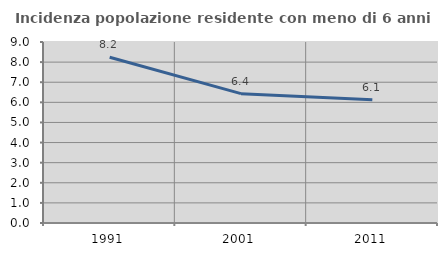
| Category | Incidenza popolazione residente con meno di 6 anni |
|---|---|
| 1991.0 | 8.239 |
| 2001.0 | 6.432 |
| 2011.0 | 6.133 |